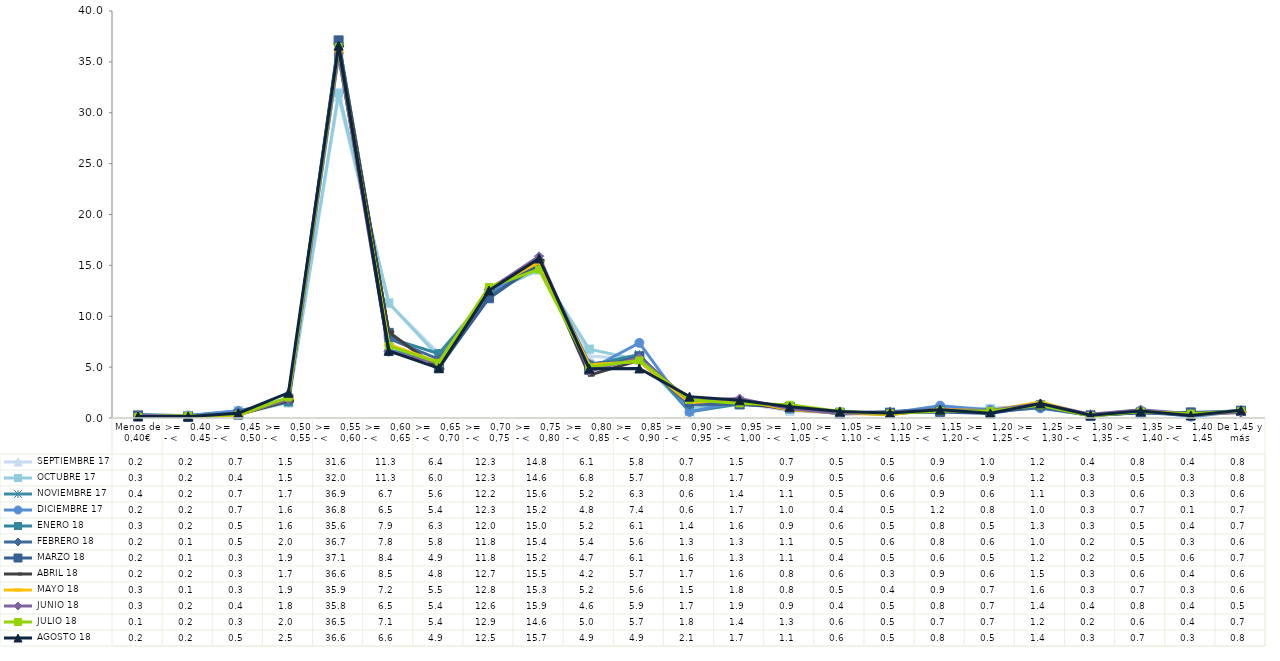
| Category |  SEPTIEMBRE 17 |  OCTUBRE 17 |  NOVIEMBRE 17 |  DICIEMBRE 17 |  ENERO 18 |  FEBRERO 18 |  MARZO 18 |  ABRIL 18 |  MAYO 18 |  JUNIO 18 |  JULIO 18 |  AGOSTO 18 |
|---|---|---|---|---|---|---|---|---|---|---|---|---|
| Menos de 0,40€ | 0.18 | 0.25 | 0.35 | 0.16 | 0.27 | 0.23 | 0.24 | 0.2 | 0.25 | 0.28 | 0.12 | 0.15 |
| >=   0.40 - <    0.45 | 0.21 | 0.22 | 0.21 | 0.24 | 0.17 | 0.08 | 0.1 | 0.16 | 0.11 | 0.17 | 0.22 | 0.15 |
| >=   0,45 - <    0,50 | 0.67 | 0.37 | 0.7 | 0.71 | 0.47 | 0.47 | 0.33 | 0.32 | 0.28 | 0.4 | 0.33 | 0.47 |
| >=   0,50 - <    0,55 | 1.51 | 1.53 | 1.68 | 1.63 | 1.59 | 1.95 | 1.9 | 1.69 | 1.94 | 1.81 | 2.02 | 2.48 |
| >=   0,55 - <    0,60 | 31.58 | 31.95 | 36.88 | 36.78 | 35.62 | 36.65 | 37.11 | 36.55 | 35.9 | 35.81 | 36.45 | 36.59 |
| >=   0,60 - <    0,65 | 11.29 | 11.31 | 6.69 | 6.53 | 7.87 | 7.82 | 8.37 | 8.46 | 7.24 | 6.54 | 7.09 | 6.6 |
| >=   0,65 - <   0,70 | 6.36 | 6.02 | 5.56 | 5.41 | 6.32 | 5.77 | 4.94 | 4.82 | 5.48 | 5.37 | 5.43 | 4.89 |
| >=   0,70 - <   0,75 | 12.3 | 12.29 | 12.24 | 12.31 | 12 | 11.76 | 11.77 | 12.66 | 12.8 | 12.63 | 12.87 | 12.53 |
| >=   0,75 - <   0,80 | 14.82 | 14.55 | 15.56 | 15.2 | 14.99 | 15.39 | 15.19 | 15.48 | 15.29 | 15.89 | 14.6 | 15.68 |
| >=   0,80 - <   0,85 | 6.09 | 6.77 | 5.19 | 4.77 | 5.21 | 5.36 | 4.73 | 4.21 | 5.24 | 4.61 | 5.02 | 4.85 |
| >=   0,85 - <   0,90 | 5.78 | 5.71 | 6.25 | 7.38 | 6.08 | 5.62 | 6.06 | 5.68 | 5.56 | 5.93 | 5.66 | 4.87 |
| >=   0,90 - <    0,95 | 0.74 | 0.83 | 0.6 | 0.6 | 1.37 | 1.29 | 1.62 | 1.67 | 1.52 | 1.71 | 1.79 | 2.1 |
| >=   0,95 - <   1,00 | 1.46 | 1.65 | 1.38 | 1.65 | 1.56 | 1.34 | 1.33 | 1.6 | 1.79 | 1.92 | 1.43 | 1.74 |
| >=   1,00 - <   1,05 | 0.7 | 0.87 | 1.09 | 0.95 | 0.9 | 1.06 | 1.09 | 0.82 | 0.81 | 0.91 | 1.3 | 1.1 |
| >=   1,05 - <    1,10 | 0.46 | 0.46 | 0.48 | 0.44 | 0.57 | 0.46 | 0.4 | 0.55 | 0.46 | 0.44 | 0.63 | 0.64 |
| >=   1,10 - <   1,15 | 0.49 | 0.55 | 0.56 | 0.49 | 0.51 | 0.64 | 0.52 | 0.34 | 0.35 | 0.54 | 0.45 | 0.48 |
| >=   1,15 - <    1,20 | 0.91 | 0.63 | 0.91 | 1.21 | 0.8 | 0.83 | 0.6 | 0.85 | 0.86 | 0.78 | 0.7 | 0.82 |
| >=   1,20 - <    1,25 | 0.99 | 0.91 | 0.64 | 0.79 | 0.52 | 0.57 | 0.45 | 0.55 | 0.71 | 0.73 | 0.69 | 0.46 |
| >=   1,25 - <    1,30 | 1.15 | 1.23 | 1.14 | 0.95 | 1.3 | 1.04 | 1.23 | 1.47 | 1.56 | 1.42 | 1.24 | 1.43 |
| >=   1,30 - <    1,35 | 0.38 | 0.33 | 0.34 | 0.28 | 0.3 | 0.24 | 0.21 | 0.26 | 0.28 | 0.37 | 0.2 | 0.28 |
| >=   1,35 - <    1,40 | 0.78 | 0.53 | 0.6 | 0.74 | 0.51 | 0.51 | 0.54 | 0.64 | 0.67 | 0.81 | 0.63 | 0.68 |
| >=   1,40 - <    1,45 | 0.41 | 0.25 | 0.32 | 0.13 | 0.37 | 0.32 | 0.55 | 0.42 | 0.31 | 0.42 | 0.43 | 0.25 |
| De 1,45 y más | 0.76 | 0.78 | 0.63 | 0.66 | 0.68 | 0.59 | 0.7 | 0.59 | 0.59 | 0.51 | 0.68 | 0.76 |